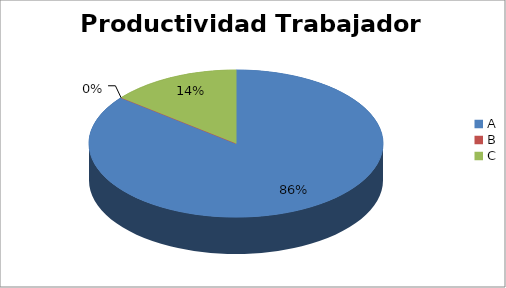
| Category | Series 0 |
|---|---|
| A | 85.714 |
| B | 0 |
| C | 14.286 |